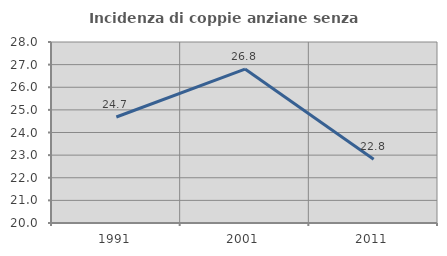
| Category | Incidenza di coppie anziane senza figli  |
|---|---|
| 1991.0 | 24.686 |
| 2001.0 | 26.804 |
| 2011.0 | 22.816 |